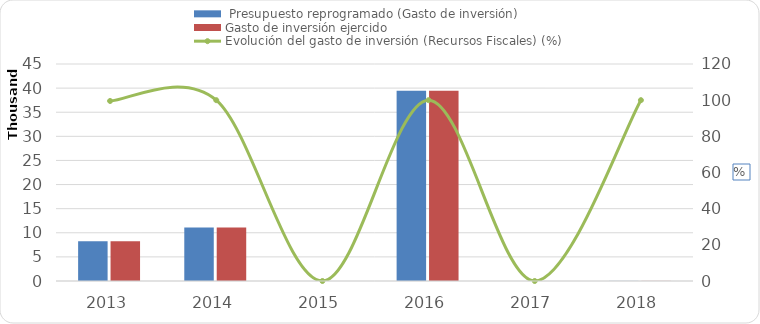
| Category |  Presupuesto reprogramado (Gasto de inversión) | Gasto de inversión ejercido |
|---|---|---|
| 2013 | 8247.4 | 8247.4 |
| 2014 | 11074.7 | 11074.7 |
| 2015 | 0 | 0 |
| 2016 | 39440.1 | 39440.1 |
| 2017 | 0 | 0 |
| 2018 | 21.924 | 21.924 |